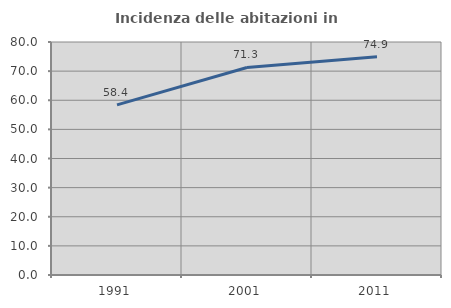
| Category | Incidenza delle abitazioni in proprietà  |
|---|---|
| 1991.0 | 58.402 |
| 2001.0 | 71.266 |
| 2011.0 | 74.932 |